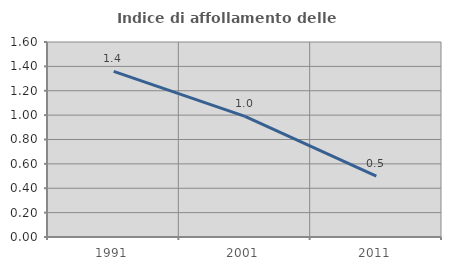
| Category | Indice di affollamento delle abitazioni  |
|---|---|
| 1991.0 | 1.359 |
| 2001.0 | 0.99 |
| 2011.0 | 0.5 |